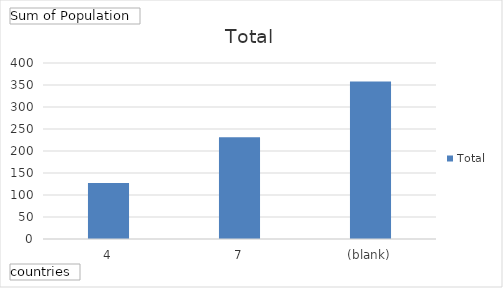
| Category | Total |
|---|---|
| 4 | 127 |
| 7 | 231 |
| (blank) | 358 |